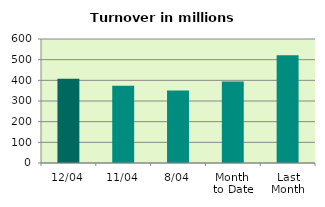
| Category | Series 0 |
|---|---|
| 12/04 | 407.873 |
| 11/04 | 373.695 |
| 8/04 | 351.39 |
| Month 
to Date | 394.026 |
| Last
Month | 521.26 |